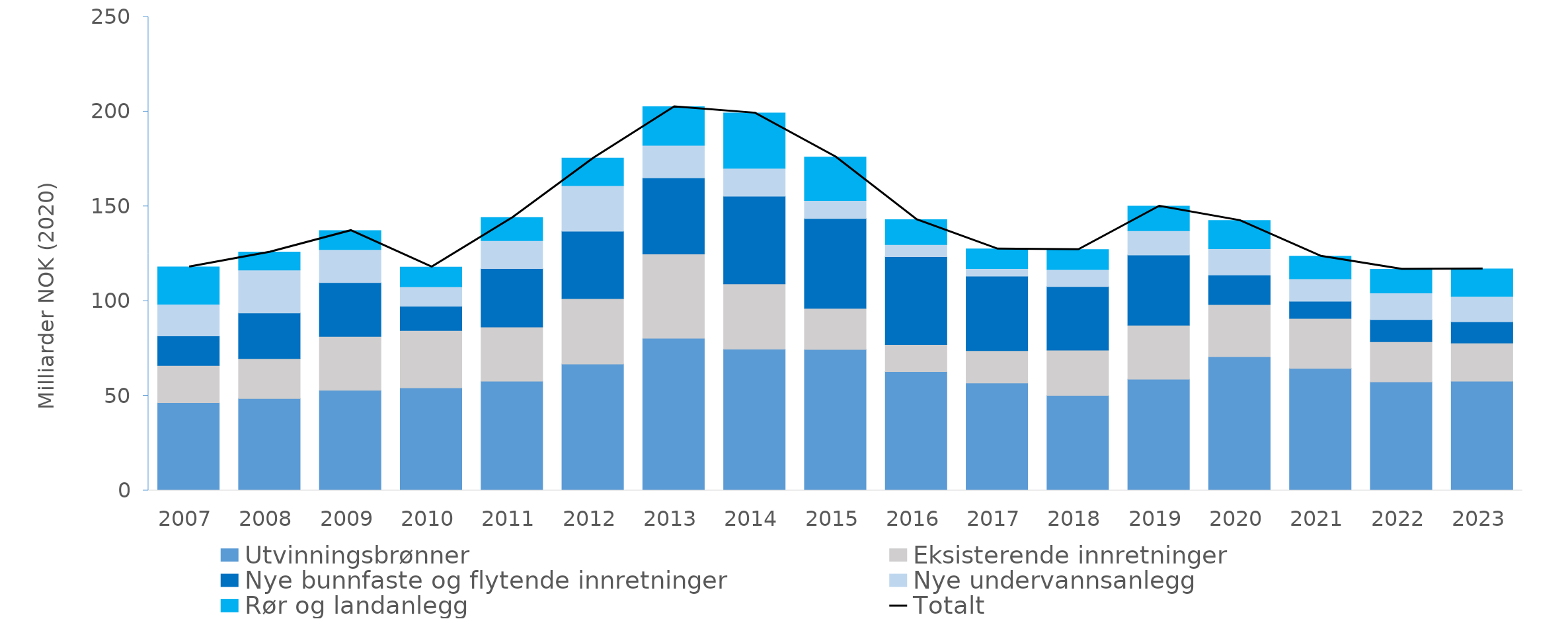
| Category | Utvinningsbrønner | Eksisterende innretninger | Nye bunnfaste og flytende innretninger | Nye undervannsanlegg | Rør og landanlegg |
|---|---|---|---|---|---|
| 2007.0 | 46.398 | 19.583 | 15.615 | 16.735 | 19.672 |
| 2008.0 | 48.59 | 21.019 | 24.105 | 22.617 | 9.549 |
| 2009.0 | 52.945 | 28.352 | 28.472 | 17.411 | 10.042 |
| 2010.0 | 54.262 | 30.223 | 12.788 | 10.326 | 10.375 |
| 2011.0 | 57.708 | 28.588 | 30.885 | 14.74 | 12.163 |
| 2012.0 | 66.812 | 34.475 | 35.598 | 24.008 | 14.599 |
| 2013.0 | 80.386 | 44.411 | 40.179 | 17.17 | 20.438 |
| 2014.0 | 74.603 | 34.486 | 46.244 | 14.749 | 29.147 |
| 2015.0 | 74.422 | 21.684 | 47.497 | 9.457 | 22.932 |
| 2016.0 | 62.766 | 14.248 | 46.411 | 6.38 | 13.191 |
| 2017.0 | 56.786 | 17.079 | 39.243 | 4.038 | 10.346 |
| 2018.0 | 50.188 | 23.936 | 33.528 | 9.016 | 10.512 |
| 2019.0 | 58.778 | 28.508 | 37.029 | 12.759 | 13.02 |
| 2020.0 | 70.662 | 27.517 | 15.58 | 13.892 | 14.835 |
| 2021.0 | 64.532 | 26.278 | 9.05 | 11.859 | 11.973 |
| 2022.0 | 57.359 | 21.153 | 11.703 | 14.018 | 12.576 |
| 2023.0 | 57.677 | 20.145 | 11.235 | 13.484 | 14.482 |